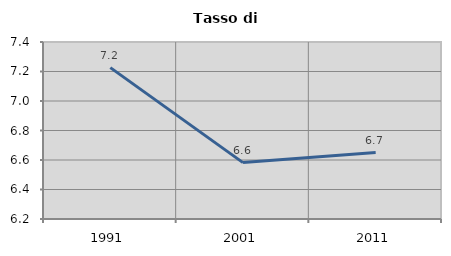
| Category | Tasso di disoccupazione   |
|---|---|
| 1991.0 | 7.226 |
| 2001.0 | 6.582 |
| 2011.0 | 6.65 |